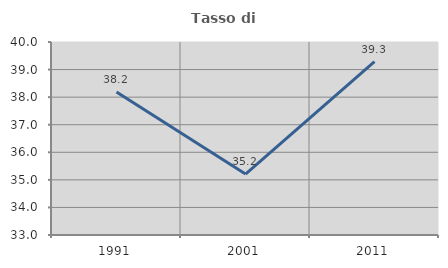
| Category | Tasso di occupazione   |
|---|---|
| 1991.0 | 38.189 |
| 2001.0 | 35.209 |
| 2011.0 | 39.287 |